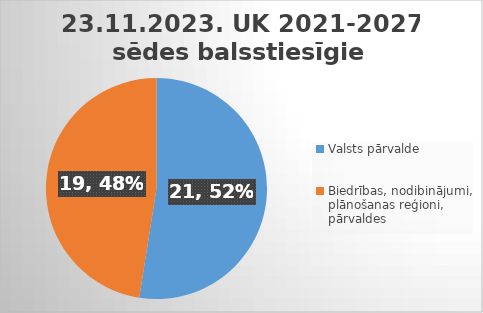
| Category | Series 0 |
|---|---|
| Valsts pārvalde | 21 |
| Biedrības, nodibinājumi, plānošanas reģioni, pārvaldes | 19 |